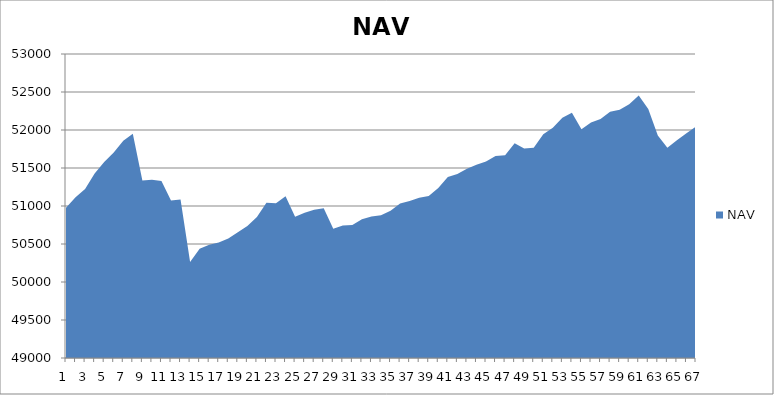
| Category | NAV |
|---|---|
| 0 | 50975.413 |
| 1 | 51115.874 |
| 2 | 51223.542 |
| 3 | 51427.364 |
| 4 | 51580.567 |
| 5 | 51704.692 |
| 6 | 51858.016 |
| 7 | 51951.766 |
| 8 | 51336.067 |
| 9 | 51345.356 |
| 10 | 51328.667 |
| 11 | 51072.985 |
| 12 | 51085.199 |
| 13 | 50261.67 |
| 14 | 50438.394 |
| 15 | 50489.896 |
| 16 | 50518.251 |
| 17 | 50572.468 |
| 18 | 50655.55 |
| 19 | 50737.787 |
| 20 | 50856.035 |
| 21 | 51041.806 |
| 22 | 51034.925 |
| 23 | 51128.589 |
| 24 | 50859.456 |
| 25 | 50911.137 |
| 26 | 50950.007 |
| 27 | 50970.175 |
| 28 | 50701.326 |
| 29 | 50743.495 |
| 30 | 50751.546 |
| 31 | 50826.725 |
| 32 | 50860.533 |
| 33 | 50879.283 |
| 34 | 50936.644 |
| 35 | 51031.381 |
| 36 | 51065.306 |
| 37 | 51109.987 |
| 38 | 51132.251 |
| 39 | 51238.242 |
| 40 | 51380.786 |
| 41 | 51420.042 |
| 42 | 51490.787 |
| 43 | 51541.14 |
| 44 | 51584.924 |
| 45 | 51657.998 |
| 46 | 51667.348 |
| 47 | 51825.763 |
| 48 | 51755.412 |
| 49 | 51767.57 |
| 50 | 51945.15 |
| 51 | 52028.391 |
| 52 | 52160.744 |
| 53 | 52227.009 |
| 54 | 52009.927 |
| 55 | 52099.094 |
| 56 | 52144.26 |
| 57 | 52240.689 |
| 58 | 52266.163 |
| 59 | 52339.405 |
| 60 | 52453.236 |
| 61 | 52275.154 |
| 62 | 51926 |
| 63 | 51766.425 |
| 64 | 51865.11 |
| 65 | 51955.727 |
| 66 | 52045.452 |